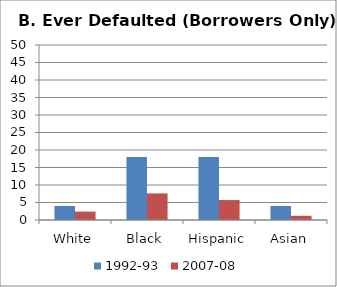
| Category | 1992-93 | 2007-08 |
|---|---|---|
| White | 4 | 2.4 |
| Black | 18 | 7.6 |
| Hispanic | 18 | 5.7 |
| Asian | 4 | 1.2 |